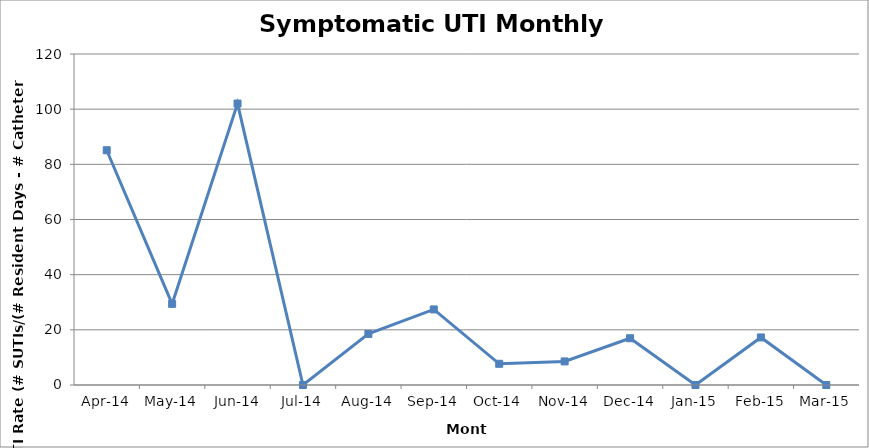
| Category | Series 2 |
|---|---|
| 2014-04-01 | 85.106 |
| 2014-05-01 | 29.412 |
| 2014-06-01 | 102.041 |
| 2014-07-01 | 0 |
| 2014-08-01 | 18.519 |
| 2014-09-01 | 27.397 |
| 2014-10-01 | 7.692 |
| 2014-11-01 | 8.547 |
| 2014-12-01 | 16.949 |
| 2015-01-01 | 0 |
| 2015-02-01 | 17.241 |
| 2015-03-01 | 0 |